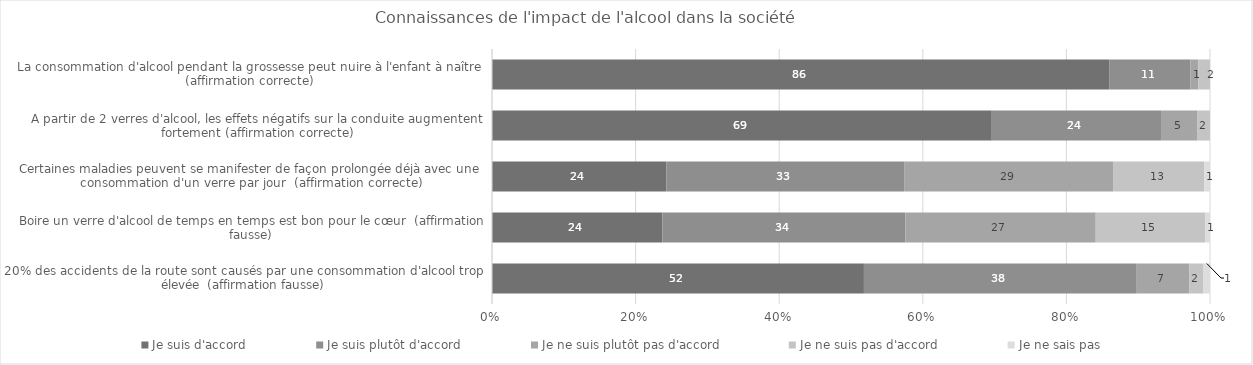
| Category | Je suis d'accord | Je suis plutôt d'accord | Je ne suis plutôt pas d'accord | Je ne suis pas d'accord | Je ne sais pas |
|---|---|---|---|---|---|
| La consommation d'alcool pendant la grossesse peut nuire à l'enfant à naître (affirmation correcte) | 85.7 | 11.3 | 1.1 | 1.6 | 0 |
| A partir de 2 verres d'alcool, les effets négatifs sur la conduite augmentent fortement (affirmation correcte) | 69.4 | 23.5 | 5 | 1.8 | 0 |
| Certaines maladies peuvent se manifester de façon prolongée déjà avec une consommation d'un verre par jour  (affirmation correcte) | 24.3 | 33.1 | 29.1 | 12.7 | 0.8 |
| Boire un verre d'alcool de temps en temps est bon pour le cœur  (affirmation fausse) | 23.7 | 33.8 | 26.5 | 15.2 | 0.7 |
| 20% des accidents de la route sont causés par une consommation d'alcool trop élevée  (affirmation fausse) | 51.8 | 38 | 7.3 | 2 | 0.9 |